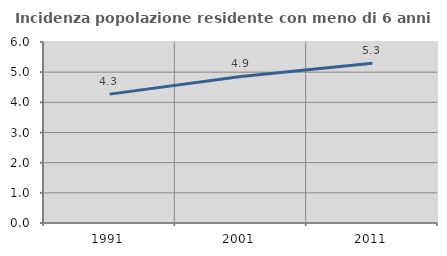
| Category | Incidenza popolazione residente con meno di 6 anni |
|---|---|
| 1991.0 | 4.272 |
| 2001.0 | 4.86 |
| 2011.0 | 5.299 |